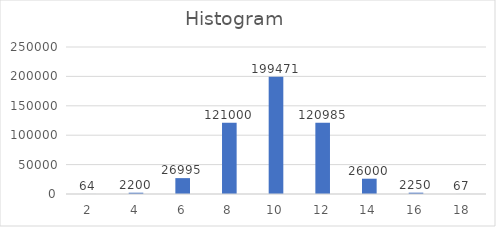
| Category | Mean of Range |
|---|---|
| 2.0 | 64 |
| 4.0 | 2200 |
| 6.0 | 26995 |
| 8.0 | 121000 |
| 10.0 | 199471 |
| 12.0 | 120985 |
| 14.0 | 26000 |
| 16.0 | 2250 |
| 18.0 | 67 |